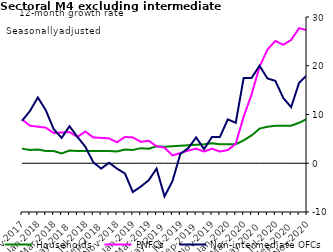
| Category | zero | Households | PNFCs | Non-intermediate OFCs |
|---|---|---|---|---|
| Nov-2017 | 0 | 3 | 9 | 8.7 |
| Dec-2017 | 0 | 2.7 | 7.7 | 10.7 |
| Jan-2018 | 0 | 2.8 | 7.5 | 13.5 |
| Feb-2018 | 0 | 2.5 | 7.3 | 10.9 |
| Mar-2018 | 0 | 2.5 | 6.2 | 7 |
| Apr-2018 | 0 | 2 | 6.3 | 5.2 |
| May-2018 | 0 | 2.6 | 6.4 | 7.6 |
| Jun-2018 | 0 | 2.5 | 5.4 | 5.4 |
| Jul-2018 | 0 | 2.5 | 6.5 | 3.4 |
| Aug-2018 | 0 | 2.5 | 5.3 | 0.2 |
| Sep-2018 | 0 | 2.5 | 5.2 | -1.1 |
| Oct-2018 | 0 | 2.5 | 5.1 | 0.1 |
| Nov-2018 | 0 | 2.4 | 4.3 | -1.1 |
| Dec-2018 | 0 | 2.8 | 5.4 | -2.1 |
| Jan-2019 | 0 | 2.7 | 5.3 | -5.9 |
| Feb-2019 | 0 | 3.1 | 4.4 | -4.8 |
| Mar-2019 | 0 | 3 | 4.6 | -3.5 |
| Apr-2019 | 0 | 3.5 | 3.5 | -1.1 |
| May-2019 | 0 | 3.4 | 3.2 | -6.8 |
| Jun-2019 | 0 | 3.5 | 1.6 | -3.7 |
| Jul-2019 | 0 | 3.6 | 2.1 | 1.9 |
| Aug-2019 | 0 | 3.7 | 2.6 | 3.1 |
| Sep-2019 | 0 | 3.8 | 3 | 5.3 |
| Oct-2019 | 0 | 3.9 | 2.4 | 2.9 |
| Nov-2019 | 0 | 4.1 | 3 | 5.4 |
| Dec-2019 | 0 | 3.9 | 2.4 | 5.4 |
| Jan-2020 | 0 | 3.9 | 2.7 | 9 |
| Feb-2020 | 0 | 3.9 | 4 | 8.3 |
| Mar-2020 | 0 | 4.7 | 9.6 | 17.5 |
| Apr-2020 | 0 | 5.7 | 14.1 | 17.5 |
| May-2020 | 0 | 7.1 | 19.8 | 20 |
| Jun-2020 | 0 | 7.5 | 23.3 | 17.4 |
| Jul-2020 | 0 | 7.7 | 25.1 | 16.9 |
| Aug-2020 | 0 | 7.7 | 24.3 | 13.4 |
| Sep-2020 | 0 | 7.7 | 25.3 | 11.5 |
| Oct-2020 | 0 | 8.3 | 27.7 | 16.5 |
| Nov-2020 | 0 | 9.1 | 27.3 | 18.1 |